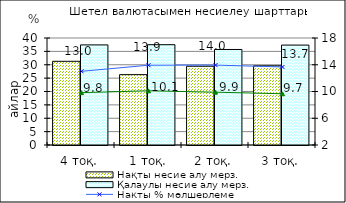
| Category | Нақты несие алу мерз.  | Қалаулы несие алу мерз. |
|---|---|---|
| 4 тоқ. | 31.29 | 37.42 |
| 1 тоқ. 2008  | 26.3 | 37.5 |
| 2 тоқ. | 29.45 | 35.71 |
| 3 тоқ. | 29.6 | 37.35 |